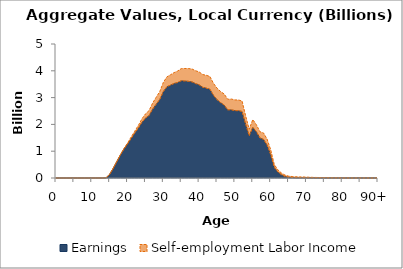
| Category | Earnings | Self-employment Labor Income |
|---|---|---|
| 0 | 0 | 0 |
|  | 0 | 0 |
| 2 | 0 | 0 |
| 3 | 0 | 0 |
| 4 | 0 | 0 |
| 5 | 0 | 0 |
| 6 | 0 | 0 |
| 7 | 0 | 0 |
| 8 | 0 | 0 |
| 9 | 0 | 0 |
| 10 | 0 | 0 |
| 11 | 0 | 0 |
| 12 | 0.015 | 0 |
| 13 | 0 | 0 |
| 14 | 10.319 | 0 |
| 15 | 136.482 | 0 |
| 16 | 364.378 | 0 |
| 17 | 614.357 | 2.831 |
| 18 | 858.577 | 12.092 |
| 19 | 1081.19 | 23.014 |
| 20 | 1269.357 | 35.081 |
| 21 | 1474.636 | 54.003 |
| 22 | 1669.29 | 75.386 |
| 23 | 1857.383 | 99.336 |
| 24 | 2074.125 | 128.456 |
| 25 | 2232.562 | 157.816 |
| 26 | 2328.552 | 186.558 |
| 27 | 2566.948 | 226.608 |
| 28 | 2750.955 | 261.843 |
| 29 | 2927.216 | 296.132 |
| 30 | 3224.294 | 342.231 |
| 31 | 3405.359 | 369.149 |
| 32 | 3465.897 | 385.771 |
| 33 | 3526.088 | 405.805 |
| 34 | 3563.306 | 427.552 |
| 35 | 3628.204 | 452.623 |
| 36 | 3618.695 | 467.608 |
| 37 | 3607.337 | 476.892 |
| 38 | 3586.209 | 483.067 |
| 39 | 3523.13 | 479.522 |
| 40 | 3477.715 | 481.297 |
| 41 | 3385.596 | 475.454 |
| 42 | 3352.244 | 480.634 |
| 43 | 3313.101 | 476.417 |
| 44 | 3088.423 | 447.579 |
| 45 | 2924.042 | 428.96 |
| 46 | 2811.264 | 416.477 |
| 47 | 2723.865 | 410.68 |
| 48 | 2541.03 | 397.192 |
| 49 | 2542.329 | 404.836 |
| 50 | 2514.264 | 399.342 |
| 51 | 2510.242 | 400.826 |
| 52 | 2483.356 | 390.123 |
| 53 | 2012.347 | 309.887 |
| 54 | 1576.211 | 241.294 |
| 55 | 1889.985 | 289.711 |
| 56 | 1727.576 | 261.352 |
| 57 | 1494.151 | 233.503 |
| 58 | 1442.19 | 238.099 |
| 59 | 1229.453 | 221.205 |
| 60 | 874.97 | 183.747 |
| 61 | 398.955 | 108.838 |
| 62 | 226.162 | 79.197 |
| 63 | 123.067 | 63.201 |
| 64 | 58.78 | 49.816 |
| 65 | 29.093 | 40.604 |
| 66 | 19.482 | 34.794 |
| 67 | 12.207 | 33.525 |
| 68 | 11.369 | 29.626 |
| 69 | 11.842 | 27.143 |
| 70 | 8.919 | 23.195 |
| 71 | 6.831 | 21.062 |
| 72 | 4.951 | 17.265 |
| 73 | 3.531 | 15.475 |
| 74 | 2.513 | 13.975 |
| 75 | 3.088 | 12.161 |
| 76 | 2.769 | 8.846 |
| 77 | 2.389 | 6.744 |
| 78 | 1.975 | 4.668 |
| 79 | 1.484 | 2.772 |
| 80 | 0.881 | 1.026 |
| 81 | 0.608 | 0.471 |
| 82 | 0.577 | 0.27 |
| 83 | 0.6 | 0.187 |
| 84 | 0.666 | 0.124 |
| 85 | 0.77 | 0.066 |
| 86 | 0.706 | 0.019 |
| 87 | 0.627 | 0.002 |
| 88 | 0.308 | 0 |
| 89 | 0.122 | 0 |
| 90+ | 0.008 | 0.003 |